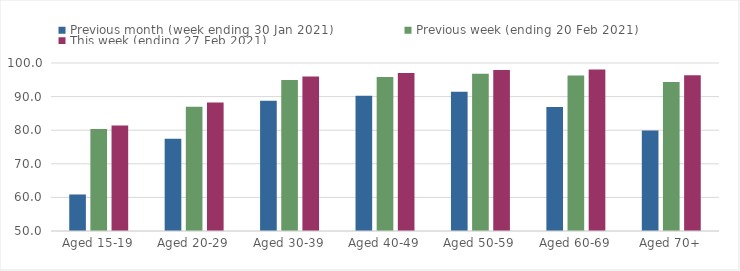
| Category | Previous month (week ending 30 Jan 2021) | Previous week (ending 20 Feb 2021) | This week (ending 27 Feb 2021) |
|---|---|---|---|
| Aged 15-19 | 60.87 | 80.38 | 81.4 |
| Aged 20-29 | 77.46 | 86.95 | 88.26 |
| Aged 30-39 | 88.78 | 94.93 | 96 |
| Aged 40-49 | 90.28 | 95.87 | 97.01 |
| Aged 50-59 | 91.41 | 96.77 | 97.93 |
| Aged 60-69 | 86.94 | 96.3 | 98.1 |
| Aged 70+ | 79.91 | 94.36 | 96.37 |